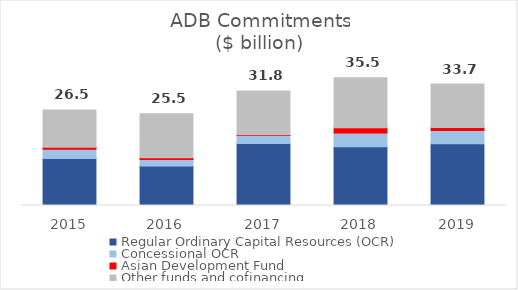
| Category | Regular Ordinary Capital Resources (OCR) | Concessional OCR | Asian Development Fund | Other funds and cofinancing |
|---|---|---|---|---|
| 2015.0 | 13.059 | 2.57 | 0.555 | 10.356 |
| 2016.0 | 10.967 | 1.805 | 0.481 | 12.213 |
| 2017.0 | 17.23 | 2.267 | 0.191 | 12.125 |
| 2018.0 | 16.286 | 3.872 | 1.418 | 13.888 |
| 2019.0 | 17.155 | 3.644 | 0.844 | 12.1 |